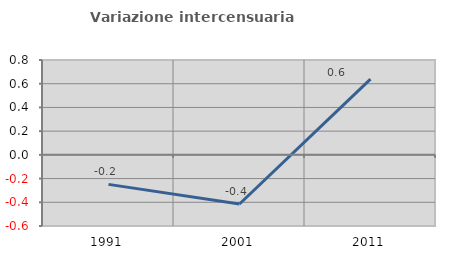
| Category | Variazione intercensuaria annua |
|---|---|
| 1991.0 | -0.249 |
| 2001.0 | -0.414 |
| 2011.0 | 0.639 |